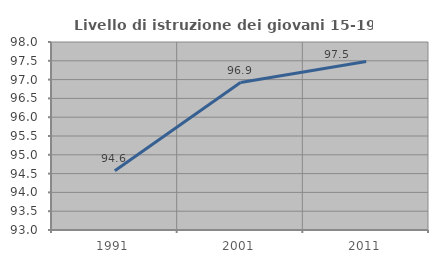
| Category | Livello di istruzione dei giovani 15-19 anni |
|---|---|
| 1991.0 | 94.574 |
| 2001.0 | 96.921 |
| 2011.0 | 97.481 |